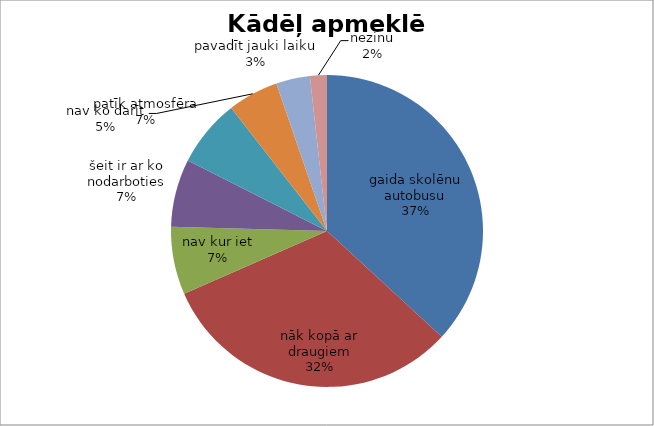
| Category | Kādēļ apmeklē BJC? |
|---|---|
| gaida skolēnu autobusu | 21 |
| nāk kopā ar draugiem | 18 |
| nav kur iet | 4 |
| šeit ir ar ko nodarboties | 4 |
| patīk atmosfēra | 4 |
| nav ko darīt | 3 |
| pavadīt jauki laiku | 2 |
| nezinu | 1 |